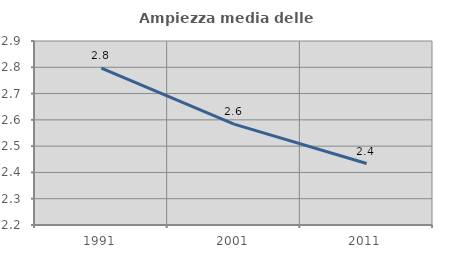
| Category | Ampiezza media delle famiglie |
|---|---|
| 1991.0 | 2.797 |
| 2001.0 | 2.584 |
| 2011.0 | 2.434 |